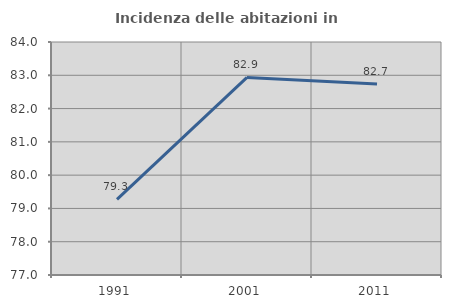
| Category | Incidenza delle abitazioni in proprietà  |
|---|---|
| 1991.0 | 79.272 |
| 2001.0 | 82.937 |
| 2011.0 | 82.74 |